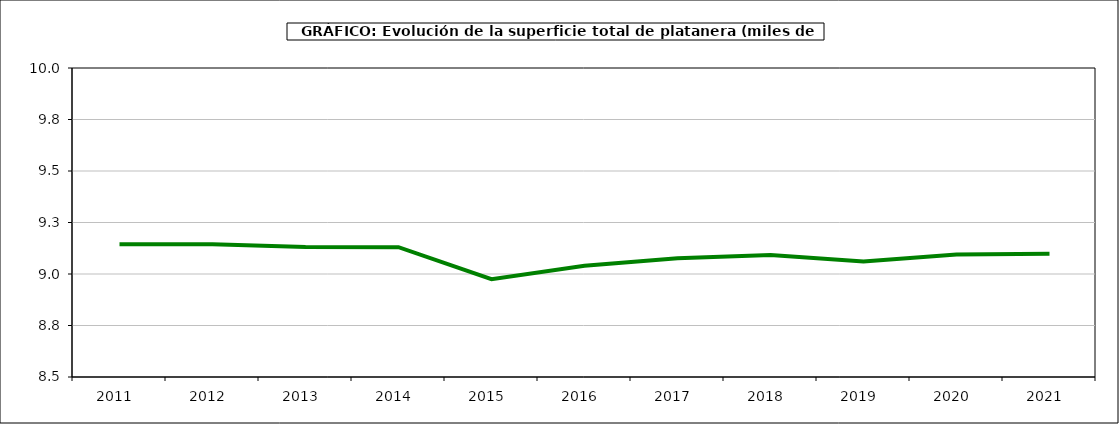
| Category | superficie platanera |
|---|---|
| 2011.0 | 9.144 |
| 2012.0 | 9.144 |
| 2013.0 | 9.131 |
| 2014.0 | 9.13 |
| 2015.0 | 8.975 |
| 2016.0 | 9.04 |
| 2017.0 | 9.076 |
| 2018.0 | 9.092 |
| 2019.0 | 9.061 |
| 2020.0 | 9.095 |
| 2021.0 | 9.098 |